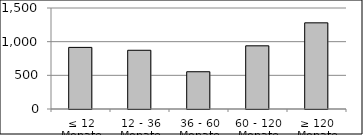
| Category | Volumen |
|---|---|
| ≤ 12 Monate | 914925726.4 |
| 12 - 36 Monate | 872257807.1 |
| 36 - 60 Monate | 553438472.88 |
| 60 - 120 Monate | 938358566.69 |
| ≥ 120 Monate | 1279691646.46 |